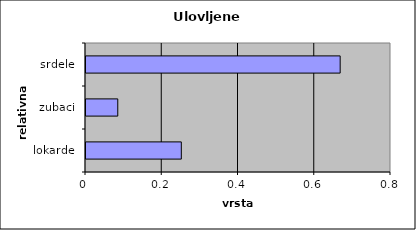
| Category | Series 0 |
|---|---|
| lokarde | 0.25 |
| zubaci | 0.083 |
| srdele | 0.667 |